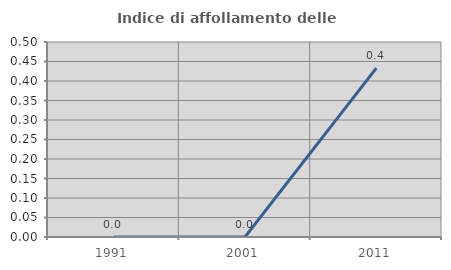
| Category | Indice di affollamento delle abitazioni  |
|---|---|
| 1991.0 | 0 |
| 2001.0 | 0 |
| 2011.0 | 0.433 |